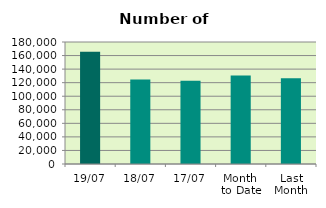
| Category | Series 0 |
|---|---|
| 19/07 | 165630 |
| 18/07 | 124520 |
| 17/07 | 122864 |
| Month 
to Date | 130571.2 |
| Last
Month | 126531 |